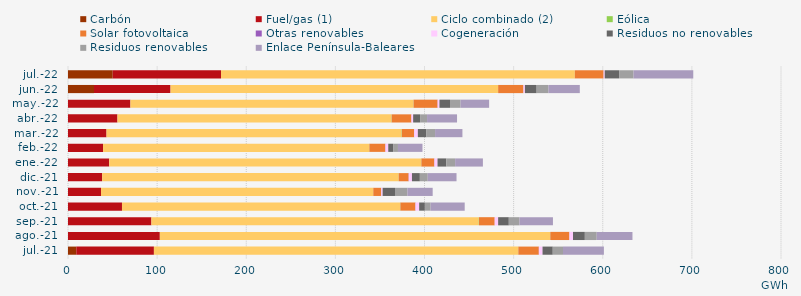
| Category | Carbón | Fuel/gas (1) | Ciclo combinado (2) | Eólica | Solar fotovoltaica | Otras renovables | Cogeneración | Residuos no renovables | Residuos renovables | Enlace Península-Baleares |
|---|---|---|---|---|---|---|---|---|---|---|
| jul.-21 | 9.293 | 87.1 | 408.794 | 0.106 | 22.966 | 0.096 | 4.086 | 11.473 | 11.473 | 45.879 |
| ago.-21 | -0.729 | 103.041 | 437.914 | 0.201 | 21.415 | 0.084 | 3.931 | 13.32 | 13.32 | 40.107 |
| sep.-21 | -0.55 | 93.586 | 367.241 | 0.274 | 17.622 | 0.081 | 3.819 | 11.973 | 11.973 | 37.549 |
| oct.-21 | -0.583 | 60.568 | 312.103 | 0.27 | 16.793 | 0.243 | 4.021 | 6.415 | 6.415 | 38.286 |
| nov.-21 | -0.582 | 37.046 | 305.438 | 0.061 | 8.81 | 0.24 | 1.412 | 13.868 | 13.868 | 28.436 |
| dic.-21 | -0.614 | 38.331 | 332.591 | 0.101 | 11.149 | 0.23 | 3.519 | 8.866 | 8.866 | 32.271 |
| ene.-22 | -0.627 | 46.217 | 350.083 | 0.216 | 14.423 | 0.285 | 3.401 | 9.871 | 9.871 | 31.159 |
| feb.-22 | -0.58 | 39.301 | 298.623 | 0.228 | 17.844 | 0.281 | 3.068 | 5.441 | 5.441 | 27.503 |
| mar.-22 | -0.669 | 43.218 | 331.001 | 0.338 | 13.693 | 0.291 | 3.993 | 9.663 | 9.663 | 30.689 |
| abr.-22 | -0.605 | 55.507 | 307.429 | 0.24 | 22.081 | 0.165 | 1.839 | 7.805 | 7.805 | 33.641 |
| may.-22 | -1.03 | 70.043 | 317.556 | 0.161 | 26.907 | 0.166 | 1.946 | 11.846 | 11.846 | 32.047 |
| jun.-22 | 29.142 | 85.898 | 367.588 | 0.028 | 28.35 | 0.111 | 1.536 | 13.186 | 13.186 | 35.225 |
| jul.-22 | 50.189 | 121.497 | 396.96 | 0.03 | 32.265 | 0.095 | 1.172 | 16.161 | 16.161 | 67.033 |